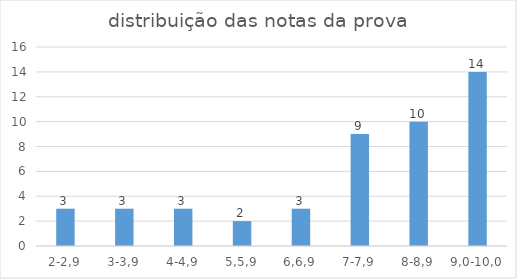
| Category | quantidade |
|---|---|
| 2-2,9 | 3 |
| 3-3,9 | 3 |
| 4-4,9 | 3 |
| 5,5,9 | 2 |
| 6,6,9 | 3 |
| 7-7,9 | 9 |
| 8-8,9 | 10 |
| 9,0-10,0 | 14 |